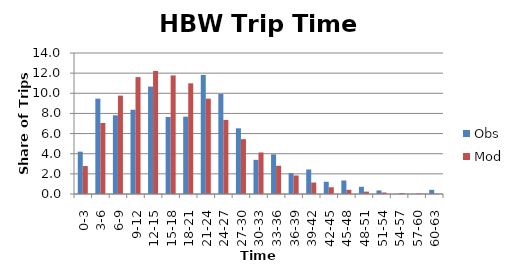
| Category | Obs | Mod |
|---|---|---|
| 0-3 | 4.204 | 2.776 |
| 3-6 | 9.467 | 7.052 |
| 6-9 | 7.813 | 9.769 |
| 9-12 | 8.366 | 11.603 |
| 12-15 | 10.664 | 12.221 |
| 15-18 | 7.651 | 11.773 |
| 18-21 | 7.68 | 10.987 |
| 21-24 | 11.821 | 9.467 |
| 24-27 | 9.937 | 7.354 |
| 27-30 | 6.524 | 5.447 |
| 30-33 | 3.39 | 4.122 |
| 33-36 | 3.939 | 2.803 |
| 36-39 | 2.069 | 1.839 |
| 39-42 | 2.435 | 1.138 |
| 42-45 | 1.215 | 0.67 |
| 45-48 | 1.344 | 0.415 |
| 48-51 | 0.714 | 0.234 |
| 51-54 | 0.357 | 0.15 |
| 54-57 | 0 | 0.09 |
| 57-60 | 0 | 0.048 |
| 60-63 | 0.411 | 0.025 |